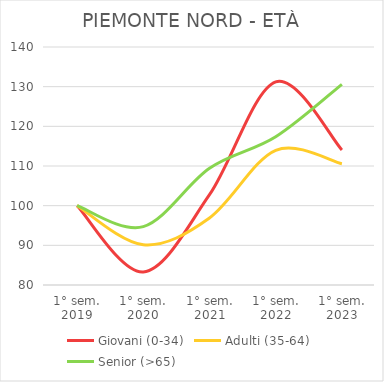
| Category | Giovani (0-34) | Adulti (35-64) | Senior (>65) |
|---|---|---|---|
| 1° sem.
2019 | 100 | 100 | 100 |
| 1° sem.
2020 | 83.287 | 90.16 | 94.706 |
| 1° sem.
2021 | 102.759 | 96.898 | 109.412 |
| 1° sem.
2022 | 131.226 | 113.961 | 117.353 |
| 1° sem.
2023 | 114.051 | 110.572 | 130.588 |